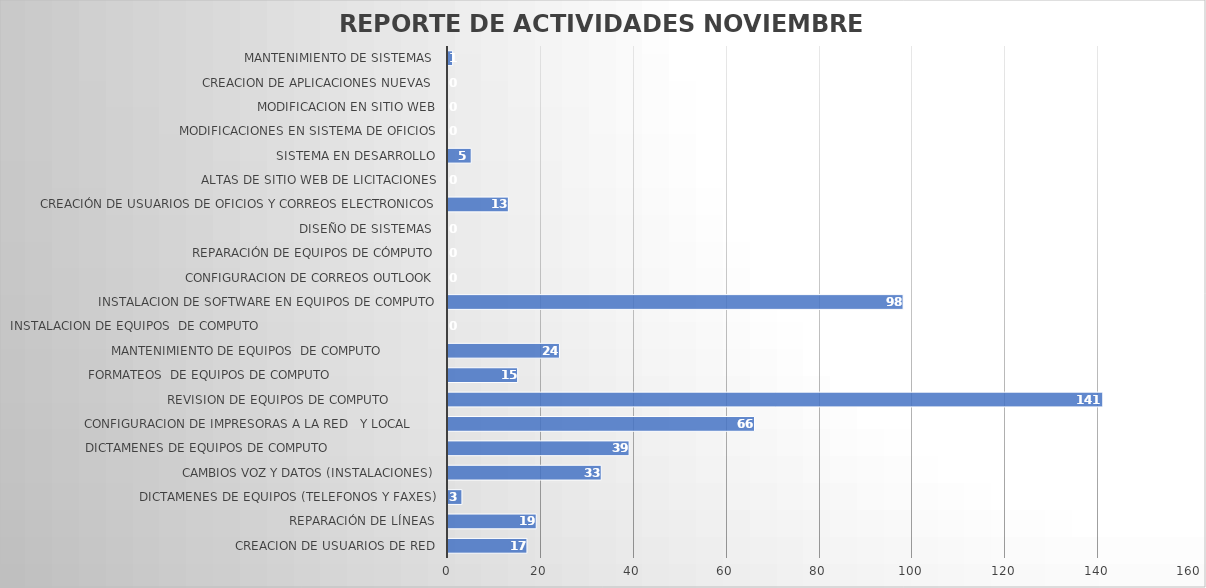
| Category | nov-22 |
|---|---|
| CREACION DE USUARIOS DE RED | 17 |
| REPARACIÓN DE LÍNEAS | 19 |
| DICTAMENES DE EQUIPOS (TELEFONOS Y FAXES) | 3 |
| CAMBIOS VOZ Y DATOS (INSTALACIONES) | 33 |
| DICTAMENES DE EQUIPOS DE COMPUTO                             | 39 |
| CONFIGURACION DE IMPRESORAS A LA RED   Y LOCAL       | 66 |
| REVISION DE EQUIPOS DE COMPUTO             | 141 |
| FORMATEOS  DE EQUIPOS DE COMPUTO                            | 15 |
| MANTENIMIENTO DE EQUIPOS  DE COMPUTO               | 24 |
| INSTALACION DE EQUIPOS  DE COMPUTO                                               | 0 |
| INSTALACION DE SOFTWARE EN EQUIPOS DE COMPUTO | 98 |
| CONFIGURACION DE CORREOS OUTLOOK | 0 |
| REPARACIÓN DE EQUIPOS DE CÓMPUTO | 0 |
| DISEÑO DE SISTEMAS  | 0 |
| CREACIÓN DE USUARIOS DE OFICIOS Y CORREOS ELECTRONICOS | 13 |
| ALTAS DE SITIO WEB DE LICITACIONES | 0 |
| SISTEMA EN DESARROLLO | 5 |
| MODIFICACIONES EN SISTEMA DE OFICIOS | 0 |
| MODIFICACION EN SITIO WEB | 0 |
| CREACION DE APLICACIONES NUEVAS  | 0 |
| MANTENIMIENTO DE SISTEMAS  | 1 |